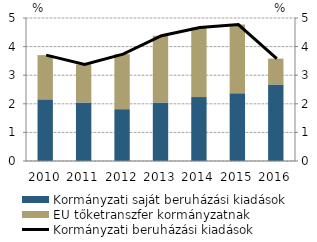
| Category | Kormányzati saját beruházási kiadások | EU tőketranszfer kormányzatnak |
|---|---|---|
| 2010.0 | 2.156 | 1.547 |
| 2011.0 | 2.049 | 1.329 |
| 2012.0 | 1.812 | 1.924 |
| 2013.0 | 2.047 | 2.335 |
| 2014.0 | 2.237 | 2.429 |
| 2015.0 | 2.372 | 2.397 |
| 2016.0 | 2.674 | 0.906 |